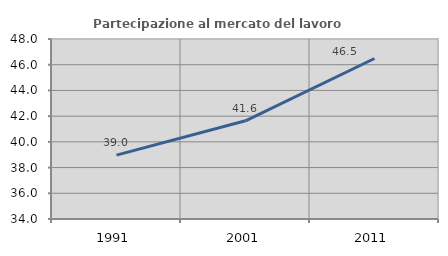
| Category | Partecipazione al mercato del lavoro  femminile |
|---|---|
| 1991.0 | 38.97 |
| 2001.0 | 41.636 |
| 2011.0 | 46.483 |